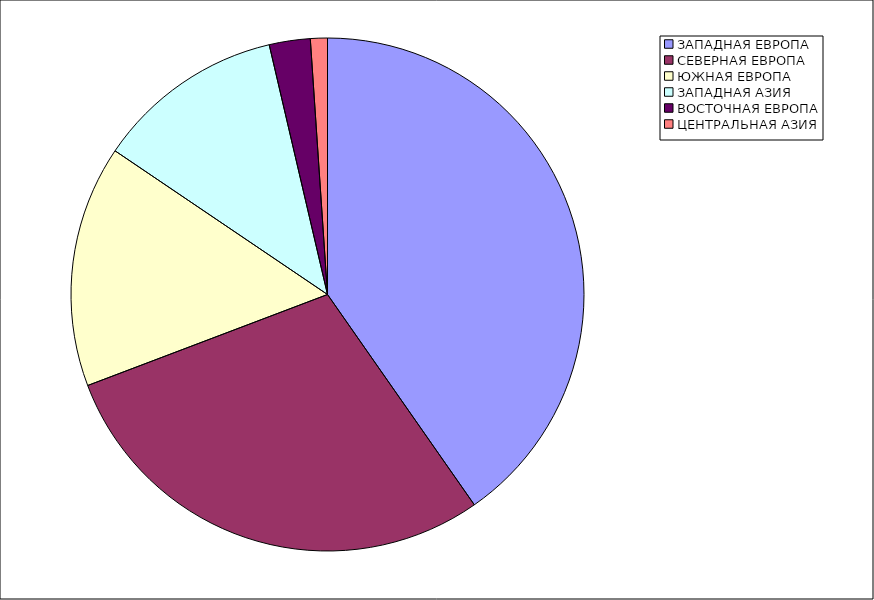
| Category | Оборот |
|---|---|
| ЗАПАДНАЯ ЕВРОПА | 40.299 |
| СЕВЕРНАЯ ЕВРОПА | 28.928 |
| ЮЖНАЯ ЕВРОПА | 15.237 |
| ЗАПАДНАЯ АЗИЯ | 11.885 |
| ВОСТОЧНАЯ ЕВРОПА | 2.581 |
| ЦЕНТРАЛЬНАЯ АЗИЯ | 1.07 |